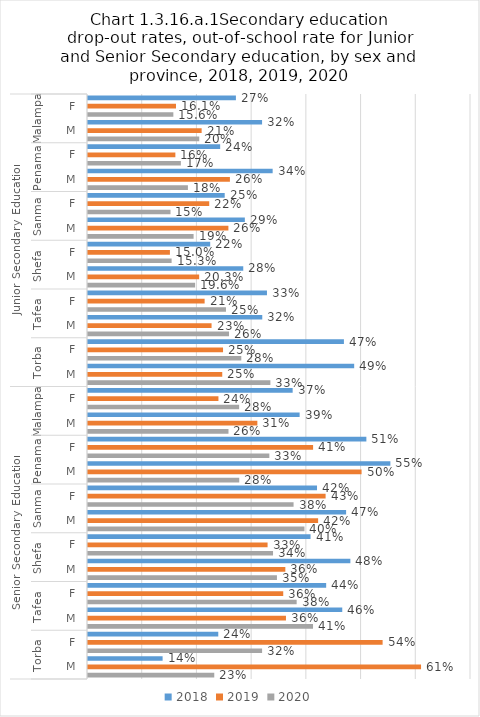
| Category | 2018 | 2019 | 2020 |
|---|---|---|---|
| 0 | 0.27 | 0.161 | 0.156 |
| 1 | 0.318 | 0.208 | 0.203 |
| 2 | 0.242 | 0.16 | 0.17 |
| 3 | 0.337 | 0.259 | 0.183 |
| 4 | 0.25 | 0.222 | 0.151 |
| 5 | 0.287 | 0.257 | 0.193 |
| 6 | 0.223 | 0.15 | 0.153 |
| 7 | 0.284 | 0.203 | 0.196 |
| 8 | 0.327 | 0.213 | 0.252 |
| 9 | 0.319 | 0.226 | 0.258 |
| 10 | 0.468 | 0.247 | 0.28 |
| 11 | 0.486 | 0.245 | 0.333 |
| 12 | 0.374 | 0.238 | 0.276 |
| 13 | 0.387 | 0.31 | 0.257 |
| 14 | 0.509 | 0.411 | 0.331 |
| 15 | 0.553 | 0.5 | 0.276 |
| 16 | 0.419 | 0.434 | 0.376 |
| 17 | 0.472 | 0.421 | 0.396 |
| 18 | 0.407 | 0.328 | 0.338 |
| 19 | 0.48 | 0.361 | 0.345 |
| 20 | 0.435 | 0.357 | 0.381 |
| 21 | 0.465 | 0.362 | 0.411 |
| 22 | 0.238 | 0.538 | 0.318 |
| 23 | 0.136 | 0.609 | 0.231 |